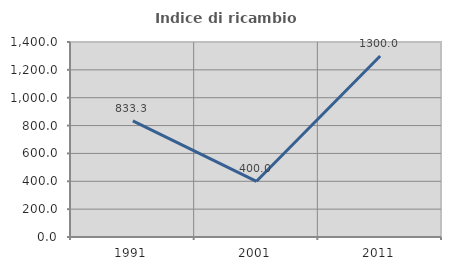
| Category | Indice di ricambio occupazionale  |
|---|---|
| 1991.0 | 833.333 |
| 2001.0 | 400 |
| 2011.0 | 1300 |